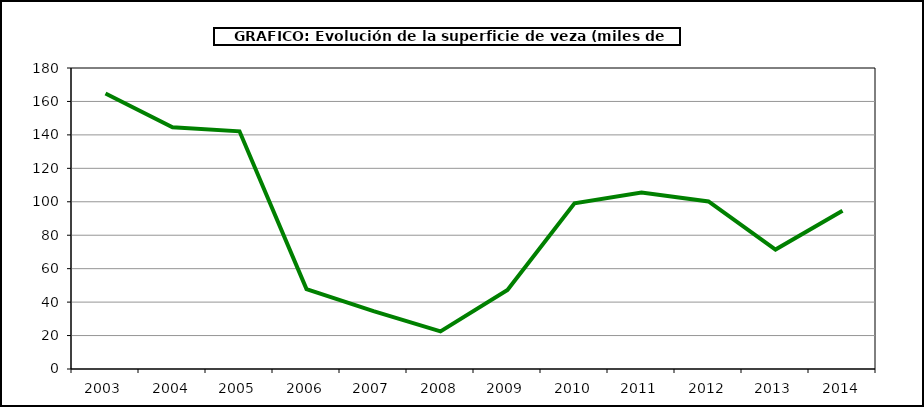
| Category | Superficie |
|---|---|
| 2003.0 | 164.708 |
| 2004.0 | 144.529 |
| 2005.0 | 142.14 |
| 2006.0 | 47.791 |
| 2007.0 | 34.592 |
| 2008.0 | 22.52 |
| 2009.0 | 47.3 |
| 2010.0 | 99.058 |
| 2011.0 | 105.49 |
| 2012.0 | 100.2 |
| 2013.0 | 71.44 |
| 2014.0 | 94.69 |